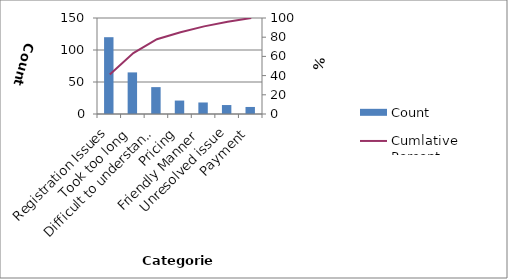
| Category | Count |
|---|---|
| Registration Issues | 120 |
| Took too long | 65 |
| Difficult to understand  | 42 |
| Pricing | 21 |
| Friendly Manner | 18 |
| Unresolved issue | 14 |
| Payment | 11 |